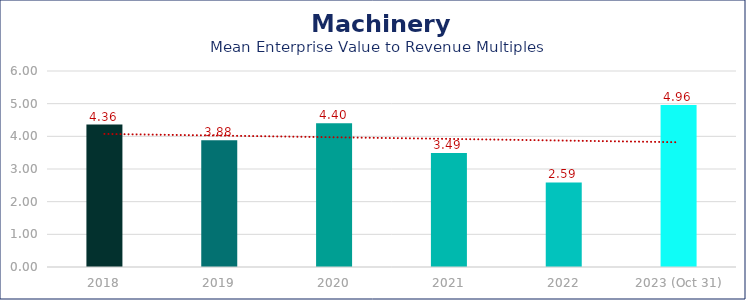
| Category | Machinery |
|---|---|
| 2018 | 4.36 |
| 2019 | 3.88 |
| 2020 | 4.4 |
| 2021 | 3.49 |
| 2022 | 2.59 |
| 2023 (Oct 31) | 4.96 |